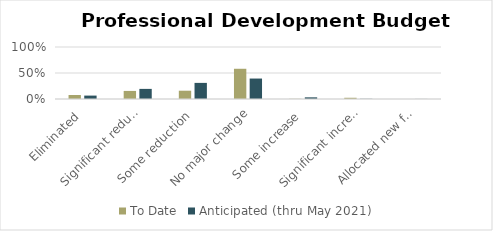
| Category | To Date | Anticipated (thru May 2021) |
|---|---|---|
| Eliminated | 0.076 | 0.066 |
| Significant reduction | 0.155 | 0.194 |
| Some reduction | 0.159 | 0.31 |
| No major change | 0.581 | 0.393 |
| Some increase | 0.004 | 0.032 |
| Significant increase | 0.024 | 0.004 |
| Allocated new funding | 0 | 0.001 |